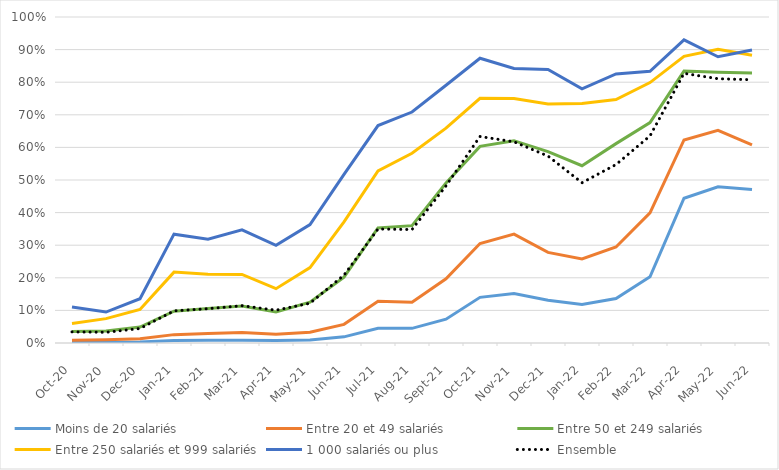
| Category | Moins de 20 salariés | Entre 20 et 49 salariés | Entre 50 et 249 salariés | Entre 250 salariés et 999 salariés | 1 000 salariés ou plus | Ensemble |
|---|---|---|---|---|---|---|
| 2020-10-01 | 0.002 | 0.009 | 0.035 | 0.06 | 0.111 | 0.034 |
| 2020-11-01 | 0.002 | 0.01 | 0.037 | 0.075 | 0.095 | 0.033 |
| 2020-12-01 | 0.003 | 0.013 | 0.049 | 0.103 | 0.136 | 0.044 |
| 2021-01-01 | 0.008 | 0.026 | 0.097 | 0.217 | 0.334 | 0.099 |
| 2021-02-01 | 0.008 | 0.029 | 0.106 | 0.211 | 0.319 | 0.105 |
| 2021-03-01 | 0.008 | 0.032 | 0.113 | 0.21 | 0.347 | 0.114 |
| 2021-04-01 | 0.008 | 0.027 | 0.095 | 0.167 | 0.3 | 0.101 |
| 2021-05-01 | 0.009 | 0.033 | 0.125 | 0.231 | 0.363 | 0.122 |
| 2021-06-01 | 0.019 | 0.057 | 0.202 | 0.372 | 0.517 | 0.208 |
| 2021-07-01 | 0.045 | 0.128 | 0.353 | 0.528 | 0.667 | 0.35 |
| 2021-08-01 | 0.045 | 0.125 | 0.36 | 0.582 | 0.708 | 0.348 |
| 2021-09-01 | 0.073 | 0.197 | 0.491 | 0.659 | 0.79 | 0.482 |
| 2021-10-01 | 0.14 | 0.305 | 0.603 | 0.751 | 0.873 | 0.633 |
| 2021-11-01 | 0.152 | 0.334 | 0.621 | 0.75 | 0.842 | 0.617 |
| 2021-12-01 | 0.131 | 0.278 | 0.587 | 0.733 | 0.839 | 0.573 |
| 2022-01-01 | 0.118 | 0.258 | 0.544 | 0.735 | 0.779 | 0.492 |
| 2022-02-01 | 0.136 | 0.294 | 0.612 | 0.747 | 0.825 | 0.547 |
| 2022-03-01 | 0.203 | 0.399 | 0.676 | 0.799 | 0.833 | 0.635 |
| 2022-04-01 | 0.444 | 0.623 | 0.834 | 0.879 | 0.93 | 0.827 |
| 2022-05-01 | 0.479 | 0.652 | 0.83 | 0.901 | 0.878 | 0.811 |
| 2022-06-01 | 0.471 | 0.607 | 0.828 | 0.882 | 0.899 | 0.808 |